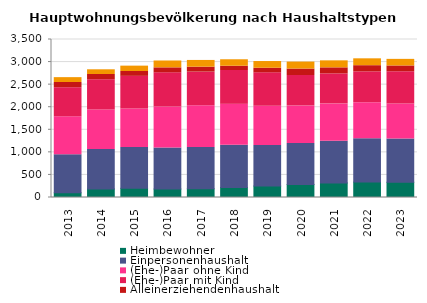
| Category | Heimbewohner | Einpersonenhaushalt | (Ehe-)Paar ohne Kind | (Ehe-)Paar mit Kind | Alleinerziehendenhaushalt | sonstiger Mehrpersonenhaushalt |
|---|---|---|---|---|---|---|
| 2013.0 | 104 | 842 | 842 | 644 | 116 | 107 |
| 2014.0 | 191 | 875 | 872 | 671 | 116 | 104 |
| 2015.0 | 203 | 902 | 857 | 722 | 107 | 119 |
| 2016.0 | 188 | 908 | 911 | 755 | 110 | 152 |
| 2017.0 | 194 | 914 | 923 | 746 | 110 | 149 |
| 2018.0 | 221 | 935 | 908 | 749 | 95 | 143 |
| 2019.0 | 254 | 899 | 869 | 740 | 101 | 149 |
| 2020.0 | 290 | 905 | 833 | 674 | 143 | 155 |
| 2021.0 | 323 | 923 | 827 | 665 | 134 | 155 |
| 2022.0 | 341 | 959 | 800 | 683 | 137 | 152 |
| 2023.0 | 338 | 959 | 773 | 716 | 128 | 146 |